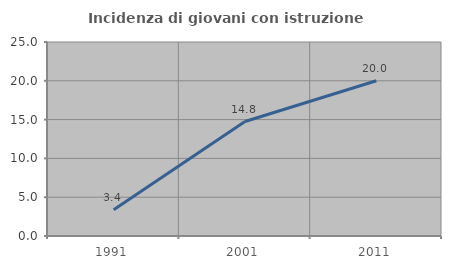
| Category | Incidenza di giovani con istruzione universitaria |
|---|---|
| 1991.0 | 3.39 |
| 2001.0 | 14.754 |
| 2011.0 | 20 |